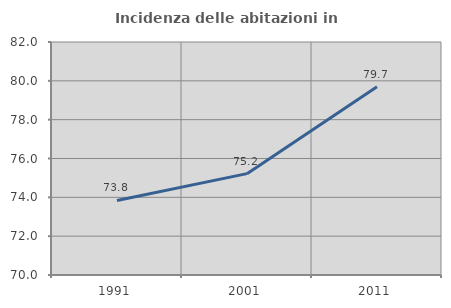
| Category | Incidenza delle abitazioni in proprietà  |
|---|---|
| 1991.0 | 73.841 |
| 2001.0 | 75.221 |
| 2011.0 | 79.698 |